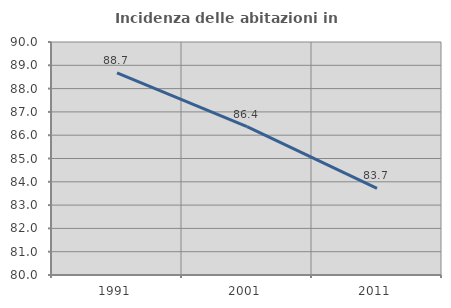
| Category | Incidenza delle abitazioni in proprietà  |
|---|---|
| 1991.0 | 88.679 |
| 2001.0 | 86.364 |
| 2011.0 | 83.721 |